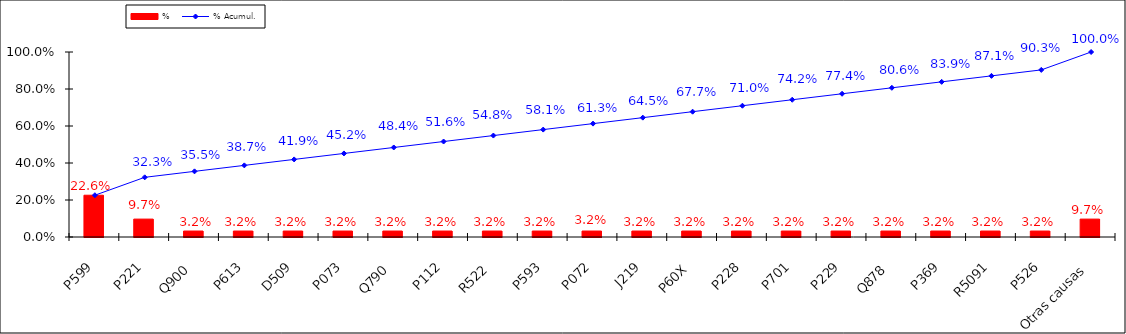
| Category | % |
|---|---|
| P599 | 0.226 |
| P221 | 0.097 |
| Q900 | 0.032 |
| P613 | 0.032 |
| D509 | 0.032 |
| P073 | 0.032 |
| Q790 | 0.032 |
| P112 | 0.032 |
| R522 | 0.032 |
| P593 | 0.032 |
| P072 | 0.032 |
| J219 | 0.032 |
| P60X | 0.032 |
| P228 | 0.032 |
| P701 | 0.032 |
| P229 | 0.032 |
| Q878 | 0.032 |
| P369 | 0.032 |
| R5091 | 0.032 |
| P526 | 0.032 |
| Otras causas | 0.097 |